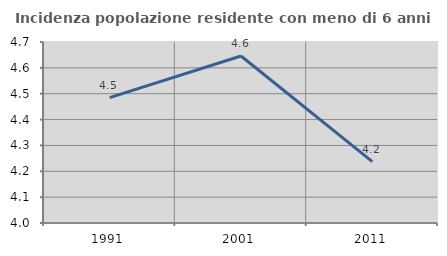
| Category | Incidenza popolazione residente con meno di 6 anni |
|---|---|
| 1991.0 | 4.485 |
| 2001.0 | 4.646 |
| 2011.0 | 4.237 |